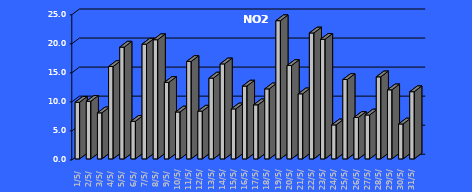
| Category | NO2 [µg/m3] |
|---|---|
| 2023-05-01 | 9.75 |
| 2023-05-02 | 9.91 |
| 2023-05-03 | 7.927 |
| 2023-05-04 | 15.899 |
| 2023-05-05 | 19.244 |
| 2023-05-06 | 6.472 |
| 2023-05-07 | 19.752 |
| 2023-05-08 | 20.514 |
| 2023-05-09 | 13.166 |
| 2023-05-10 | 8.073 |
| 2023-05-11 | 16.773 |
| 2023-05-12 | 8.218 |
| 2023-05-13 | 13.919 |
| 2023-05-14 | 16.354 |
| 2023-05-15 | 8.606 |
| 2023-05-16 | 12.538 |
| 2023-05-17 | 9.304 |
| 2023-05-18 | 12.052 |
| 2023-05-19 | 23.792 |
| 2023-05-20 | 16.071 |
| 2023-05-21 | 11.205 |
| 2023-05-22 | 21.675 |
| 2023-05-23 | 20.585 |
| 2023-05-24 | 5.849 |
| 2023-05-25 | 13.666 |
| 2023-05-26 | 7.141 |
| 2023-05-27 | 7.559 |
| 2023-05-28 | 14.124 |
| 2023-05-29 | 11.889 |
| 2023-05-30 | 6.009 |
| 2023-05-31 | 11.568 |